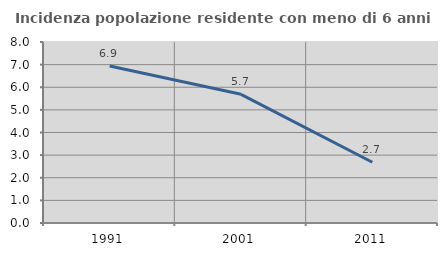
| Category | Incidenza popolazione residente con meno di 6 anni |
|---|---|
| 1991.0 | 6.942 |
| 2001.0 | 5.687 |
| 2011.0 | 2.686 |